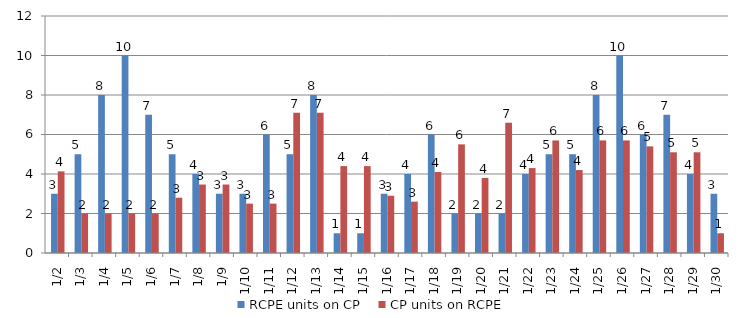
| Category | RCPE units on CP | CP units on RCPE |
|---|---|---|
| 2016-01-02 | 3 | 4.133 |
| 2016-01-03 | 5 | 2 |
| 2016-01-04 | 8 | 2 |
| 2016-01-05 | 10 | 2 |
| 2016-01-06 | 7 | 2 |
| 2016-01-07 | 5 | 2.8 |
| 2016-01-08 | 4 | 3.467 |
| 2016-01-09 | 3 | 3.467 |
| 2016-01-10 | 3 | 2.5 |
| 2016-01-11 | 6 | 2.5 |
| 2016-01-12 | 5 | 7.1 |
| 2016-01-13 | 8 | 7.1 |
| 2016-01-14 | 1 | 4.4 |
| 2016-01-15 | 1 | 4.4 |
| 2016-01-16 | 3 | 2.9 |
| 2016-01-17 | 4 | 2.6 |
| 2016-01-18 | 6 | 4.1 |
| 2016-01-19 | 2 | 5.5 |
| 2016-01-20 | 2 | 3.8 |
| 2016-01-21 | 2 | 6.6 |
| 2016-01-22 | 4 | 4.3 |
| 2016-01-23 | 5 | 5.7 |
| 2016-01-24 | 5 | 4.2 |
| 2016-01-25 | 8 | 5.7 |
| 2016-01-26 | 10 | 5.7 |
| 2016-01-27 | 6 | 5.4 |
| 2016-01-28 | 7 | 5.1 |
| 2016-01-29 | 4 | 5.1 |
| 2016-01-30 | 3 | 1 |